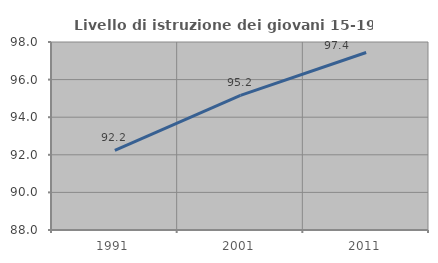
| Category | Livello di istruzione dei giovani 15-19 anni |
|---|---|
| 1991.0 | 92.233 |
| 2001.0 | 95.157 |
| 2011.0 | 97.442 |